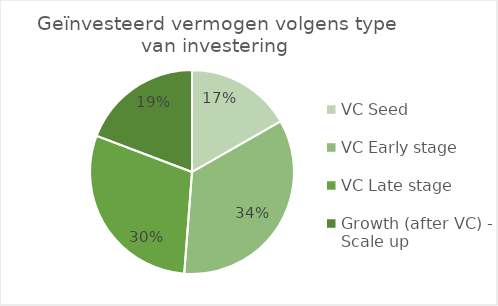
| Category | Series 0 |
|---|---|
| VC Seed | 32.804 |
| VC Early stage | 67.713 |
| VC Late stage | 57.984 |
| Growth (after VC) - Scale up | 37.765 |